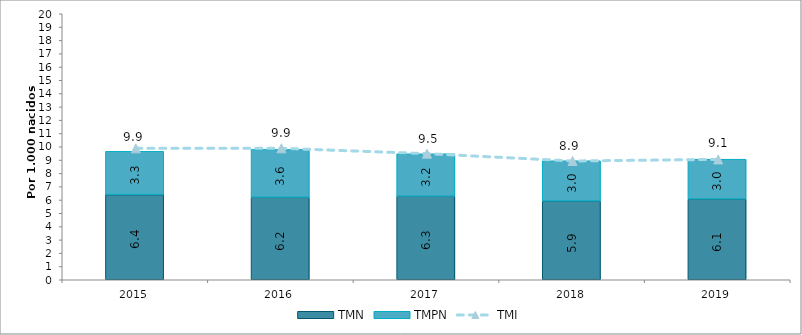
| Category | TMN | TMPN |
|---|---|---|
| 2015.0 | 6.4 | 3.256 |
| 2016.0 | 6.2 | 3.6 |
| 2017.0 | 6.282 | 3.191 |
| 2018.0 | 5.917 | 3.031 |
| 2019.0 | 6.065 | 3.001 |